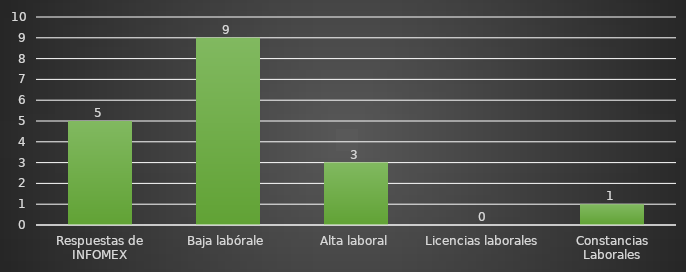
| Category | INDICADOR  |
|---|---|
| Respuestas de INFOMEX | 5 |
| Baja labórale | 9 |
| Alta laboral | 3 |
| Licencias laborales | 0 |
| Constancias Laborales | 1 |